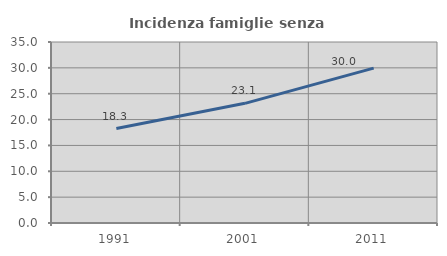
| Category | Incidenza famiglie senza nuclei |
|---|---|
| 1991.0 | 18.266 |
| 2001.0 | 23.142 |
| 2011.0 | 29.954 |